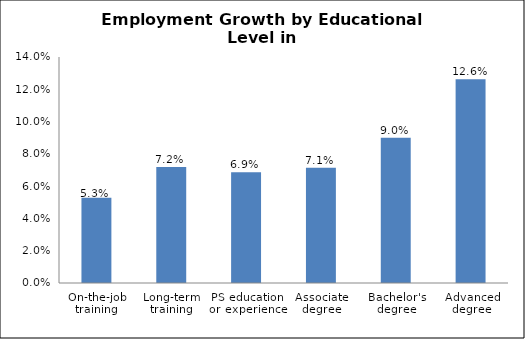
| Category | Series 0 |
|---|---|
| On-the-job training | 0.053 |
| Long-term training | 0.072 |
| PS education or experience | 0.069 |
| Associate degree | 0.071 |
| Bachelor's degree | 0.09 |
| Advanced degree | 0.126 |